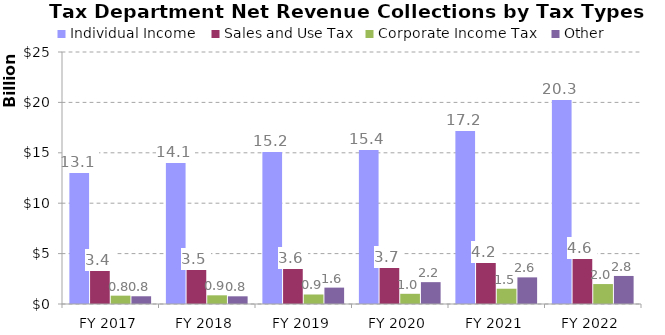
| Category | Individual Income  | Sales and Use Tax | Corporate Income Tax  | Other |
|---|---|---|---|---|
| FY 2017 | 13052887000 | 3354561000 | 826960822.31 | 767401177.69 |
| FY 2018 | 14105766000 | 3458249000 | 861897138.18 | 763035861.82 |
| FY 2019 | 15226471000 | 3580355000 | 943391000 | 1625197140.2 |
| FY 2020 | 15351592000 | 3706817000 | 1011650000 | 2167788628.13 |
| FY 2021 | 17237352000 | 4166182000 | 1515692000 | 2641396000 |
| FY 2022 | 20324954000 | 4558082000 | 1978697000 | 2782131000 |